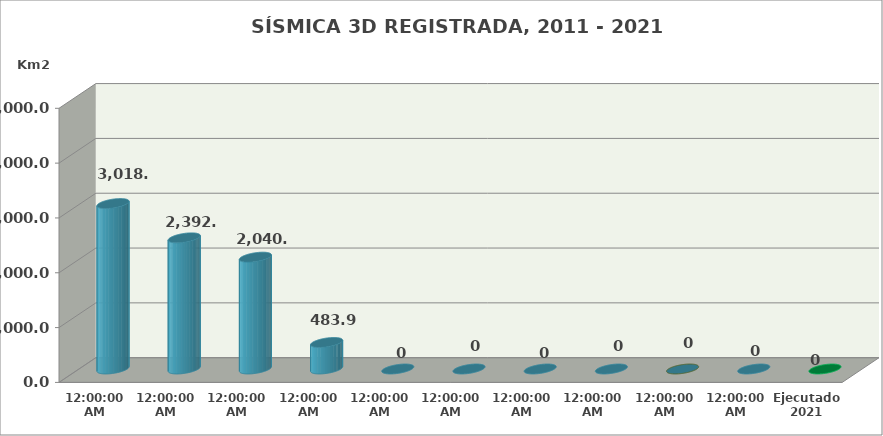
| Category | Series 0 |
|---|---|
| 2011 | 3018.02 |
| 2012 | 2392.47 |
| 2013 | 2040.1 |
| 2014 | 483.9 |
| 2015 | 0 |
| 2016 | 0 |
| 2017 | 0 |
| 2018 | 0 |
| 2019 | 0 |
| 2020 | 0 |
| Ejecutado 2021 | 0 |